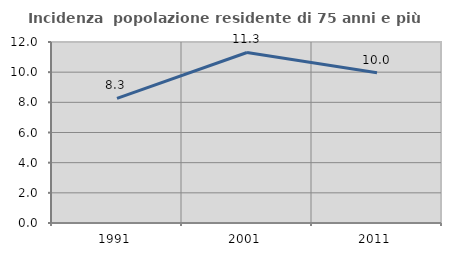
| Category | Incidenza  popolazione residente di 75 anni e più |
|---|---|
| 1991.0 | 8.264 |
| 2001.0 | 11.304 |
| 2011.0 | 9.955 |